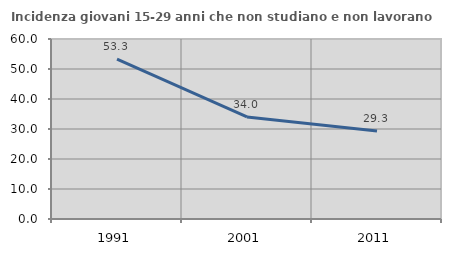
| Category | Incidenza giovani 15-29 anni che non studiano e non lavorano  |
|---|---|
| 1991.0 | 53.255 |
| 2001.0 | 34.021 |
| 2011.0 | 29.31 |